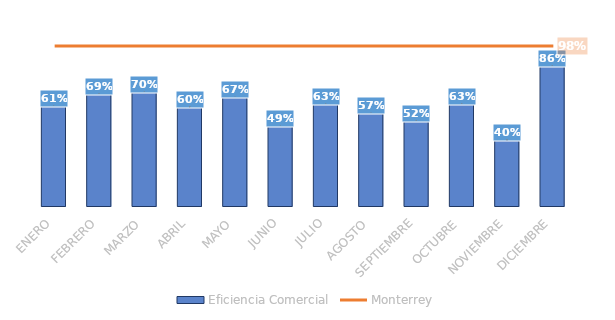
| Category | Eficiencia Comercial |
|---|---|
| ENERO | 0.614 |
| FEBRERO | 0.687 |
| MARZO | 0.7 |
| ABRIL | 0.604 |
| MAYO | 0.67 |
| JUNIO | 0.492 |
| JULIO | 0.627 |
| AGOSTO | 0.572 |
| SEPTIEMBRE | 0.521 |
| OCTUBRE | 0.625 |
| NOVIEMBRE | 0.401 |
| DICIEMBRE | 0.858 |